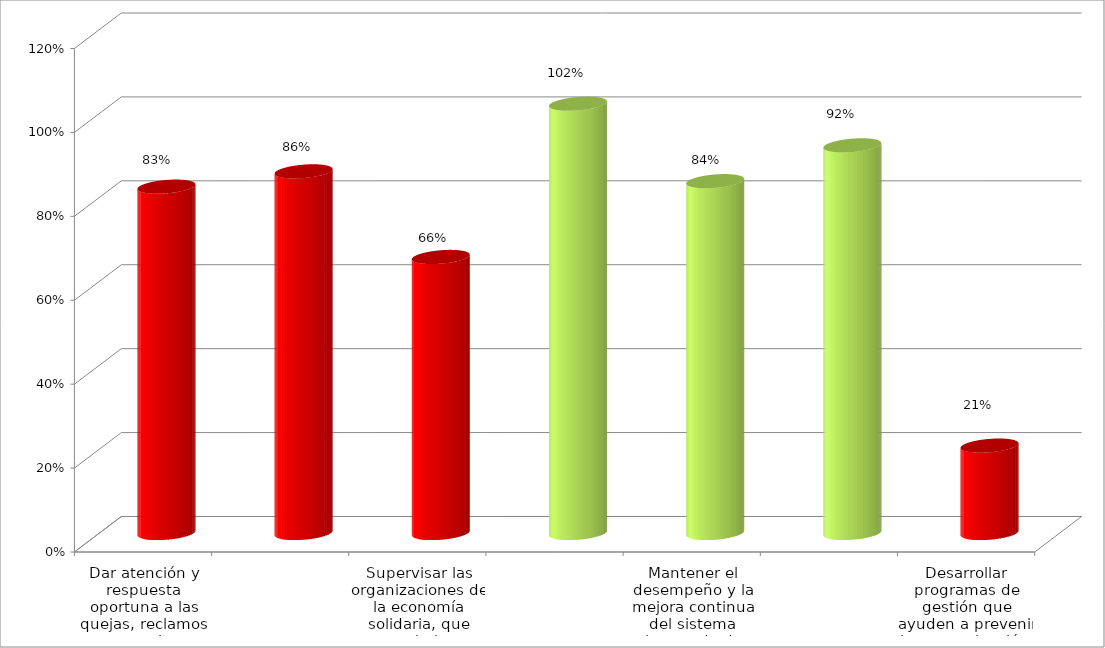
| Category | Series 0 |
|---|---|
| Dar atención y respuesta oportuna a las quejas, reclamos y consultas, formuladas por la ciudadania. | 0.825 |
| Formular, desarrollar y ejecutar, oportunamente, los proyectos de inversión de la entidad. | 0.862 |
| Supervisar las organizaciones de la economía solidaria, que estan bajo su competencia. | 0.658 |
| Mejorar los canales internos y externos de comunicación de la entidad. | 1.023 |
| Mantener el desempeño y la mejora continua del sistema integrado de gestión  | 0.839 |
| Mejorar la calidad del servicio y el medio ambiente fortaleciendo el Talento Humano. | 0.924 |
| Desarrollar programas de gestión que ayuden a prevenir la contaminación, a reducir y controlar los aspectos e impactos ambientales identificados | 0.208 |